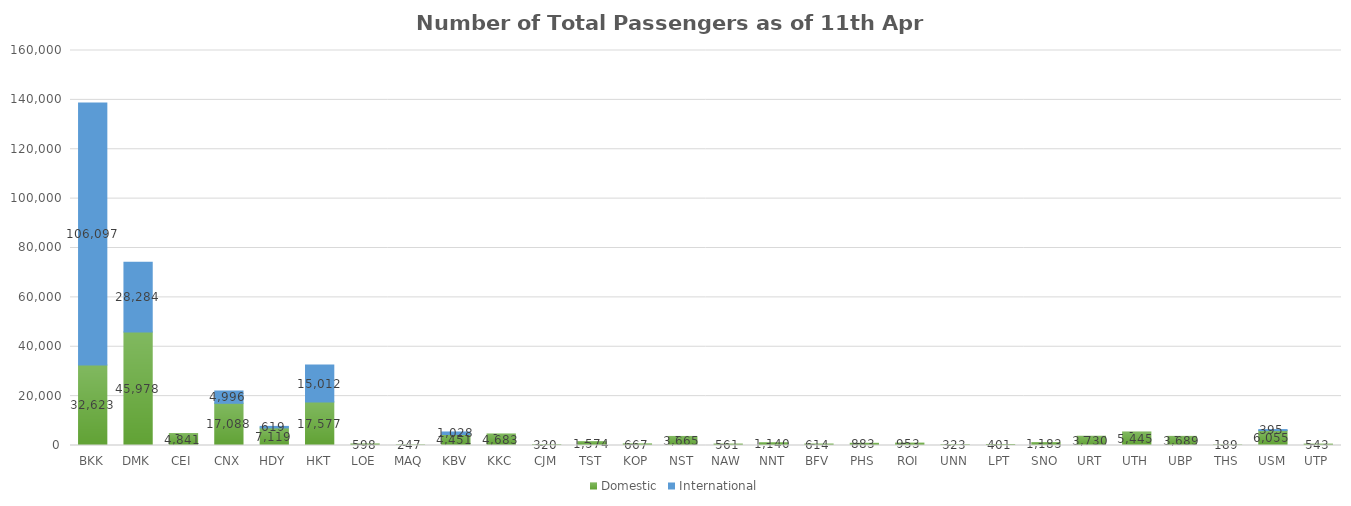
| Category | Domestic | International |
|---|---|---|
| BKK | 32623 | 106097 |
| DMK | 45978 | 28284 |
| CEI | 4841 | 0 |
| CNX | 17088 | 4996 |
| HDY | 7119 | 619 |
| HKT | 17577 | 15012 |
| LOE | 598 | 0 |
| MAQ | 247 | 0 |
| KBV | 4451 | 1028 |
| KKC | 4683 | 0 |
| CJM | 320 | 0 |
| TST | 1574 | 0 |
| KOP | 667 | 0 |
| NST | 3665 | 0 |
| NAW | 561 | 0 |
| NNT | 1140 | 0 |
| BFV | 614 | 0 |
| PHS | 883 | 0 |
| ROI | 953 | 0 |
| UNN | 323 | 0 |
| LPT | 401 | 0 |
| SNO | 1183 | 0 |
| URT | 3730 | 0 |
| UTH | 5445 | 0 |
| UBP | 3689 | 0 |
| THS | 189 | 0 |
| USM | 6055 | 395 |
| UTP | 543 | 0 |